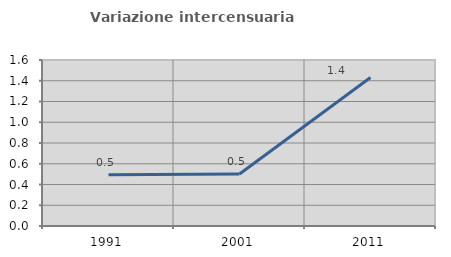
| Category | Variazione intercensuaria annua |
|---|---|
| 1991.0 | 0.494 |
| 2001.0 | 0.501 |
| 2011.0 | 1.432 |